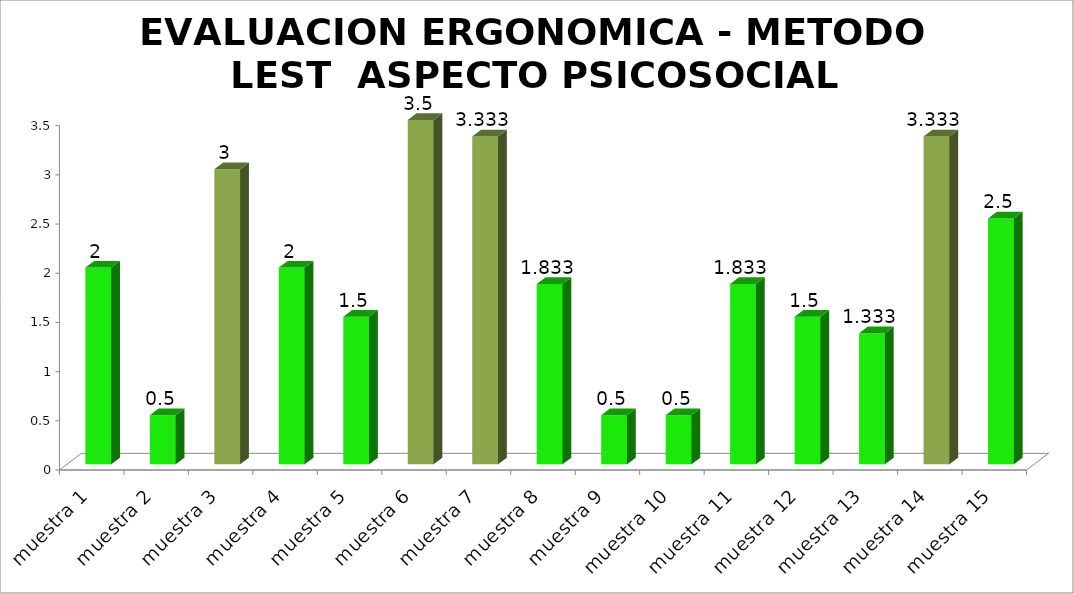
| Category | EVALUACION ERGONOMICA - METODO LEST  |
|---|---|
| muestra 1 | 2 |
| muestra 2 | 0.5 |
| muestra 3 | 3 |
| muestra 4 | 2 |
| muestra 5 | 1.5 |
| muestra 6 | 3.5 |
| muestra 7 | 3.333 |
| muestra 8 | 1.833 |
| muestra 9 | 0.5 |
| muestra 10 | 0.5 |
| muestra 11 | 1.833 |
| muestra 12 | 1.5 |
| muestra 13 | 1.333 |
| muestra 14 | 3.333 |
| muestra 15 | 2.5 |